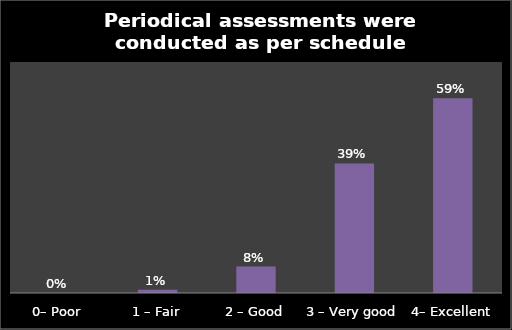
| Category | Series 0 |
|---|---|
| 0– Poor | 0 |
| 1 – Fair | 0.01 |
| 2 – Good | 0.08 |
| 3 – Very good | 0.393 |
| 4– Excellent | 0.59 |